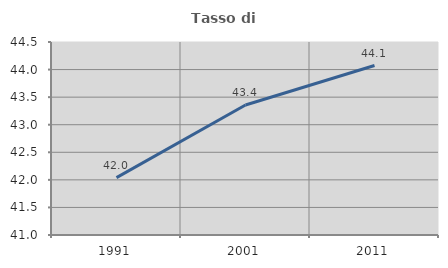
| Category | Tasso di occupazione   |
|---|---|
| 1991.0 | 42.041 |
| 2001.0 | 43.357 |
| 2011.0 | 44.074 |